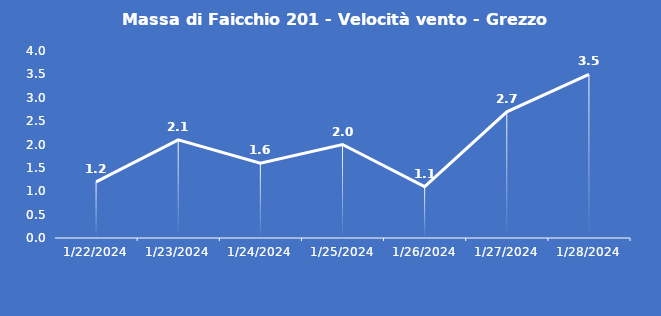
| Category | Massa di Faicchio 201 - Velocità vento - Grezzo (m/s) |
|---|---|
| 1/22/24 | 1.2 |
| 1/23/24 | 2.1 |
| 1/24/24 | 1.6 |
| 1/25/24 | 2 |
| 1/26/24 | 1.1 |
| 1/27/24 | 2.7 |
| 1/28/24 | 3.5 |